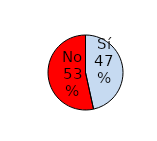
| Category | Series 1 |
|---|---|
| Sí | 81 |
| No | 93 |